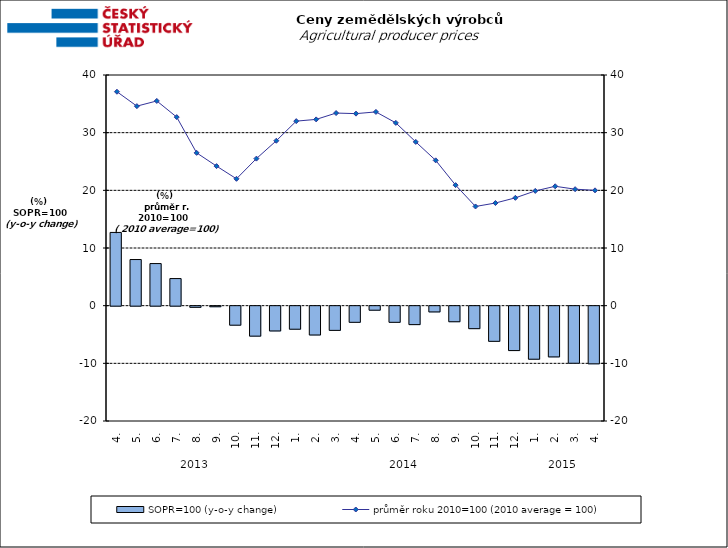
| Category | SOPR=100 (y-o-y change)   |
|---|---|
| 0 | 12.7 |
| 1 | 8 |
| 2 | 7.3 |
| 3 | 4.7 |
| 4 | -0.2 |
| 5 | -0.1 |
| 6 | -3.3 |
| 7 | -5.2 |
| 8 | -4.3 |
| 9 | -4 |
| 10 | -5 |
| 11 | -4.2 |
| 12 | -2.8 |
| 13 | -0.7 |
| 14 | -2.8 |
| 15 | -3.2 |
| 16 | -1 |
| 17 | -2.7 |
| 18 | -3.9 |
| 19 | -6.1 |
| 20 | -7.7 |
| 21 | -9.2 |
| 22 | -8.8 |
| 23 | -9.9 |
| 24 | -10 |